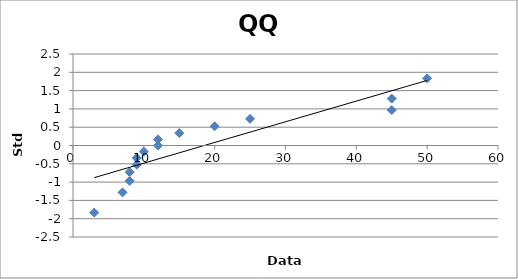
| Category | Series 0 |
|---|---|
| 3.0 | -1.834 |
| 7.0 | -1.282 |
| 8.0 | -0.967 |
| 8.0 | -0.728 |
| 9.0 | -0.524 |
| 9.0 | -0.341 |
| 10.0 | -0.168 |
| 12.0 | 0 |
| 12.0 | 0.168 |
| 15.0 | 0.341 |
| 20.0 | 0.524 |
| 25.0 | 0.728 |
| 45.0 | 0.967 |
| 45.0 | 1.282 |
| 50.0 | 1.834 |